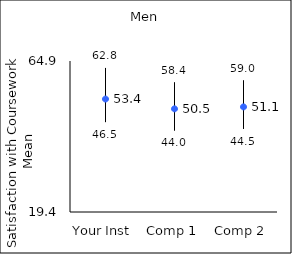
| Category | 25th percentile | 75th percentile | Mean |
|---|---|---|---|
| Your Inst | 46.5 | 62.8 | 53.44 |
| Comp 1 | 44 | 58.4 | 50.49 |
| Comp 2 | 44.5 | 59 | 51.07 |